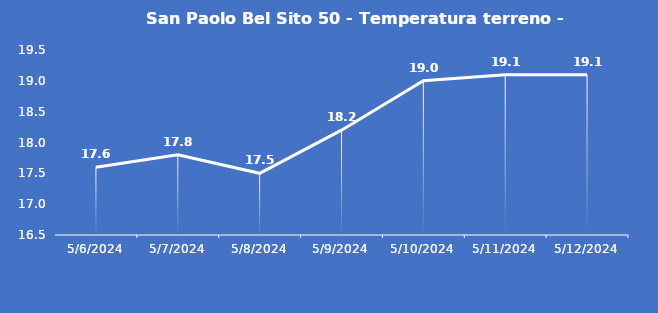
| Category | San Paolo Bel Sito 50 - Temperatura terreno - Grezzo (°C) |
|---|---|
| 5/6/24 | 17.6 |
| 5/7/24 | 17.8 |
| 5/8/24 | 17.5 |
| 5/9/24 | 18.2 |
| 5/10/24 | 19 |
| 5/11/24 | 19.1 |
| 5/12/24 | 19.1 |